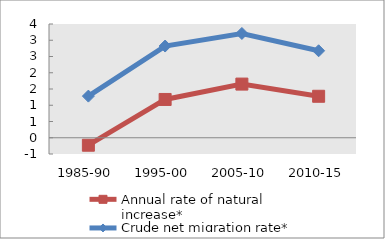
| Category | Annual rate of natural increase* | Crude net migration rate* |
|---|---|---|
| 1985-90 | -0.23 | 1.281 |
| 1995-00 | 1.178 | 2.822 |
| 2005-10 | 1.651 | 3.209 |
| 2010-15 | 1.276 | 2.676 |